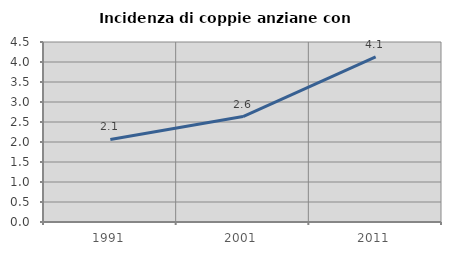
| Category | Incidenza di coppie anziane con figli |
|---|---|
| 1991.0 | 2.064 |
| 2001.0 | 2.636 |
| 2011.0 | 4.125 |